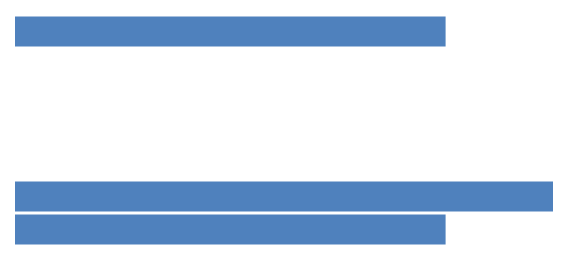
| Category | Series 0 |
|---|---|
| 0 | 4 |
| 1 | 0 |
| 2 | 0 |
| 3 | 0 |
| 4 | 0 |
| 5 | 5 |
| 6 | 4 |